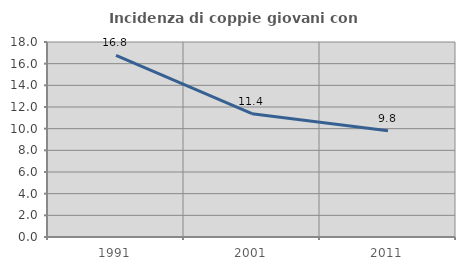
| Category | Incidenza di coppie giovani con figli |
|---|---|
| 1991.0 | 16.757 |
| 2001.0 | 11.385 |
| 2011.0 | 9.815 |